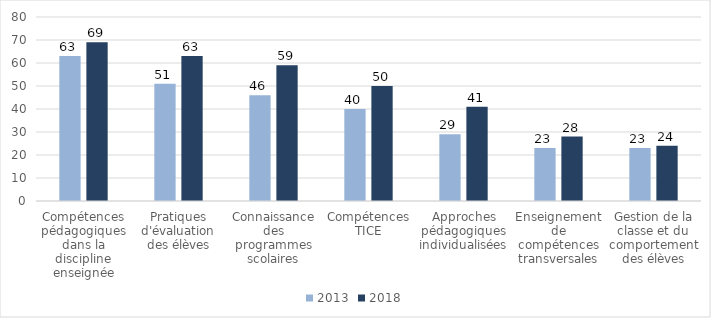
| Category | 2013 | 2018 |
|---|---|---|
| Compétences pédagogiques dans la discipline enseignée | 63 | 69 |
| Pratiques d'évaluation des élèves | 51 | 63 |
| Connaissance des programmes scolaires | 46 | 59 |
| Compétences TICE | 40 | 50 |
| Approches pédagogiques individualisées | 29 | 41 |
| Enseignement de compétences transversales | 23 | 28 |
| Gestion de la classe et du comportement des élèves | 23 | 24 |